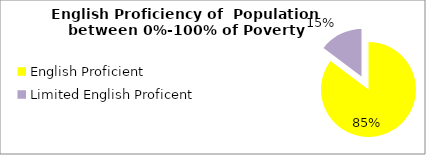
| Category | Percent |
|---|---|
| English Proficient | 0.853 |
| Limited English Proficent | 0.147 |